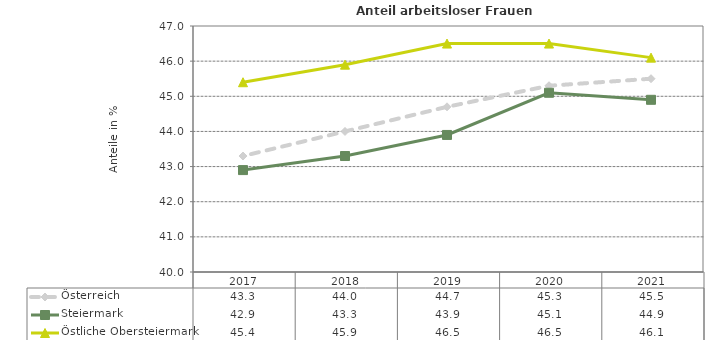
| Category | Österreich | Steiermark | Östliche Obersteiermark |
|---|---|---|---|
| 2021.0 | 45.5 | 44.9 | 46.1 |
| 2020.0 | 45.3 | 45.1 | 46.5 |
| 2019.0 | 44.7 | 43.9 | 46.5 |
| 2018.0 | 44 | 43.3 | 45.9 |
| 2017.0 | 43.3 | 42.9 | 45.4 |